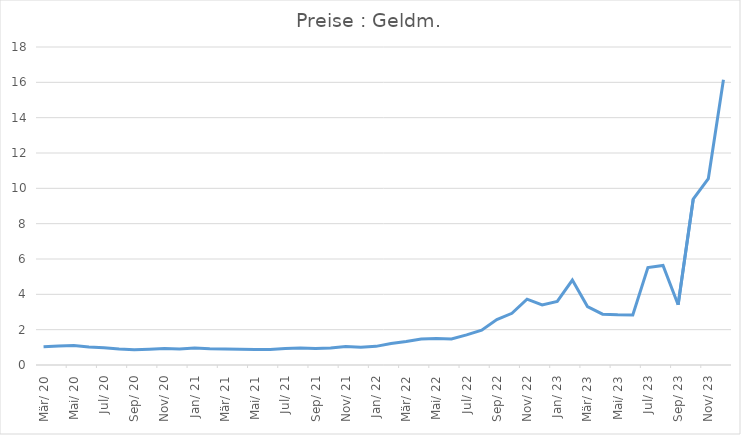
| Category | Preise : Geldm. |
|---|---|
| 1920-03-05 | 1.031 |
| 1920-04-04 12:00:00 | 1.073 |
| 1920-05-05 | 1.102 |
| 1920-06-04 12:00:00 | 1.019 |
| 1920-07-05 | 0.981 |
| 1920-08-04 12:00:00 | 0.908 |
| 1920-09-04 | 0.861 |
| 1920-10-04 12:00:00 | 0.89 |
| 1920-11-04 | 0.928 |
| 1920-12-04 12:00:00 | 0.912 |
| 1921-01-04 | 0.962 |
| 1921-02-03 12:00:00 | 0.922 |
| 1921-03-06 | 0.91 |
| 1921-04-05 12:00:00 | 0.892 |
| 1921-05-06 | 0.881 |
| 1921-06-05 12:00:00 | 0.884 |
| 1921-07-06 | 0.927 |
| 1921-08-05 12:00:00 | 0.965 |
| 1921-09-05 | 0.93 |
| 1921-10-05 12:00:00 | 0.969 |
| 1921-11-05 | 1.044 |
| 1921-12-05 12:00:00 | 1.008 |
| 1922-01-05 | 1.055 |
| 1922-02-04 12:00:00 | 1.22 |
| 1922-03-07 | 1.326 |
| 1922-04-06 12:00:00 | 1.465 |
| 1922-05-07 | 1.504 |
| 1922-06-06 12:00:00 | 1.475 |
| 1922-07-07 | 1.706 |
| 1922-08-06 12:00:00 | 1.974 |
| 1922-09-06 | 2.575 |
| 1922-10-06 12:00:00 | 2.927 |
| 1922-11-06 | 3.727 |
| 1922-12-06 12:00:00 | 3.401 |
| 1923-01-06 | 3.602 |
| 1923-02-05 12:00:00 | 4.805 |
| 1923-03-08 | 3.31 |
| 1923-04-07 12:00:00 | 2.876 |
| 1923-05-08 | 2.838 |
| 1923-06-07 12:00:00 | 2.828 |
| 1923-07-08 | 5.515 |
| 1923-08-07 12:00:00 | 5.634 |
| 1923-09-07 | 3.414 |
| 1923-10-07 12:00:00 | 9.386 |
| 1923-11-07 | 10.551 |
| 1923-12-07 12:00:00 | 16.145 |